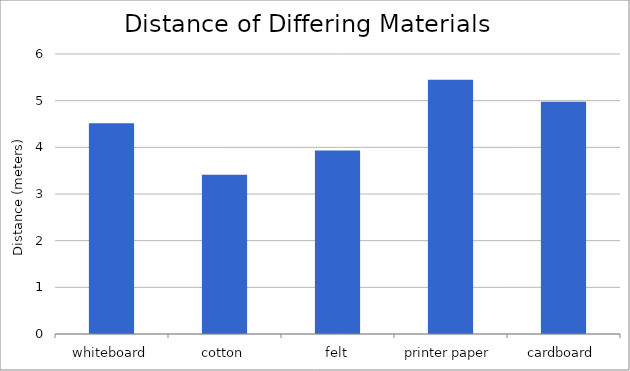
| Category | Series 0 |
|---|---|
| whiteboard | 4.516 |
| cotton | 3.412 |
| felt | 3.933 |
| printer paper | 5.45 |
| cardboard | 4.978 |